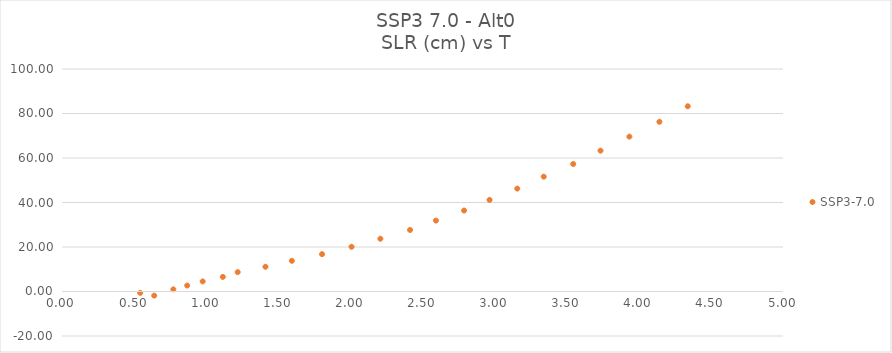
| Category | SSP3-7.0 |
|---|---|
| 0.639593181 | -1.853 |
| 0.542364652 | -0.626 |
| 0.772130534 | 0.958 |
| 0.868150926 | 2.678 |
| 0.975561417 | 4.531 |
| 1.115356613 | 6.565 |
| 1.218373475 | 8.703 |
| 1.410985436 | 11.118 |
| 1.593999848 | 13.794 |
| 1.803259946 | 16.789 |
| 2.007971221 | 20.098 |
| 2.207718083 | 23.716 |
| 2.413664456 | 27.658 |
| 2.593008574 | 31.87 |
| 2.788310632 | 36.386 |
| 2.965027005 | 41.168 |
| 3.15708926 | 46.249 |
| 3.340821123 | 51.612 |
| 3.545155632 | 57.305 |
| 3.734528966 | 63.296 |
| 3.934752593 | 69.61 |
| 4.14311073 | 76.268 |
| 4.339539848 | 83.244 |